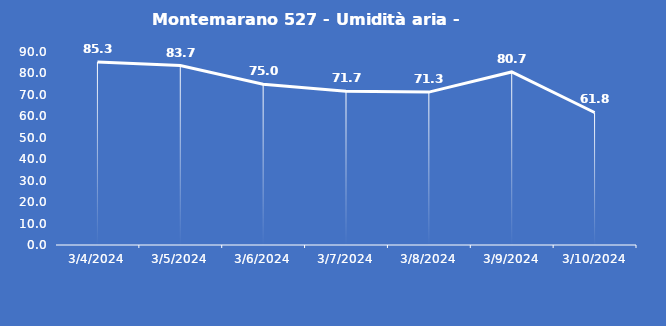
| Category | Montemarano 527 - Umidità aria - Grezzo (%) |
|---|---|
| 3/4/24 | 85.3 |
| 3/5/24 | 83.7 |
| 3/6/24 | 75 |
| 3/7/24 | 71.7 |
| 3/8/24 | 71.3 |
| 3/9/24 | 80.7 |
| 3/10/24 | 61.8 |